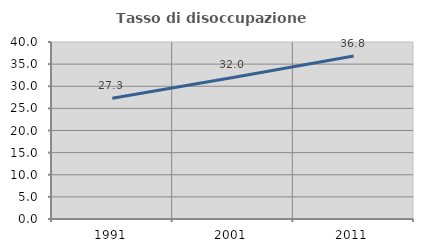
| Category | Tasso di disoccupazione giovanile  |
|---|---|
| 1991.0 | 27.273 |
| 2001.0 | 32 |
| 2011.0 | 36.842 |